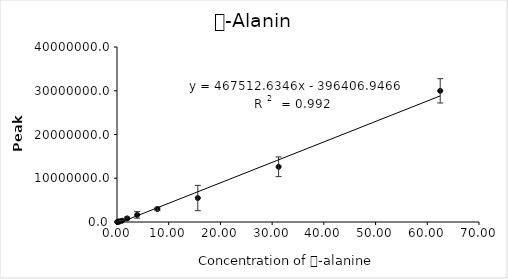
| Category | Series 0 |
|---|---|
| 0.06 | 24648.667 |
| 0.12 | 26833.667 |
| 0.24 | 53730 |
| 0.49 | 143087 |
| 0.98 | 290348.333 |
| 1.953 | 823815 |
| 3.9 | 1627422.333 |
| 7.81 | 2973093.667 |
| 15.625 | 5479046 |
| 31.25 | 12622088.333 |
| 62.5 | 29980829 |